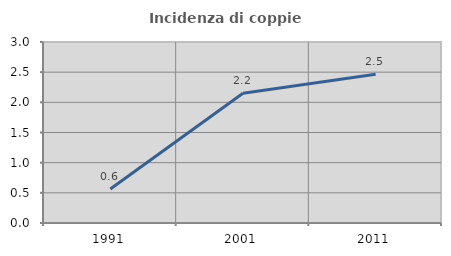
| Category | Incidenza di coppie miste |
|---|---|
| 1991.0 | 0.563 |
| 2001.0 | 2.151 |
| 2011.0 | 2.464 |